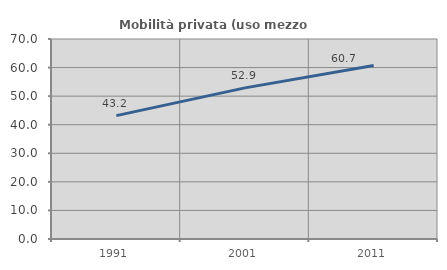
| Category | Mobilità privata (uso mezzo privato) |
|---|---|
| 1991.0 | 43.175 |
| 2001.0 | 52.9 |
| 2011.0 | 60.734 |